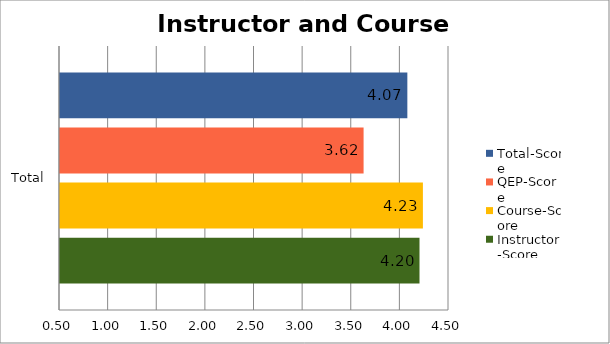
| Category | Instructor-Score | Course-Score | QEP-Score | Total-Score |
|---|---|---|---|---|
| Total | 4.197 | 4.232 | 3.622 | 4.072 |